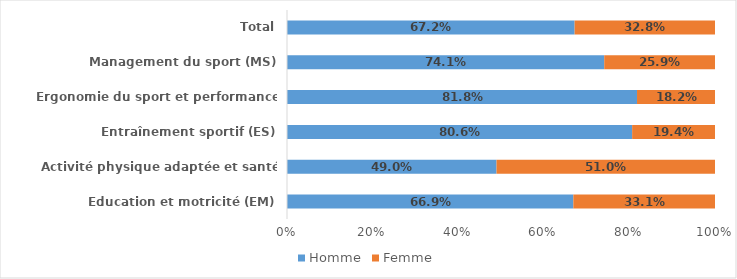
| Category | Homme | Femme |
|---|---|---|
| Education et motricité (EM) | 0.669 | 0.331 |
| Activité physique adaptée et santé (APAS) | 0.49 | 0.51 |
| Entraînement sportif (ES) | 0.806 | 0.194 |
| Ergonomie du sport et performance (ERGO) | 0.818 | 0.182 |
| Management du sport (MS) | 0.741 | 0.259 |
| Total | 0.672 | 0.328 |